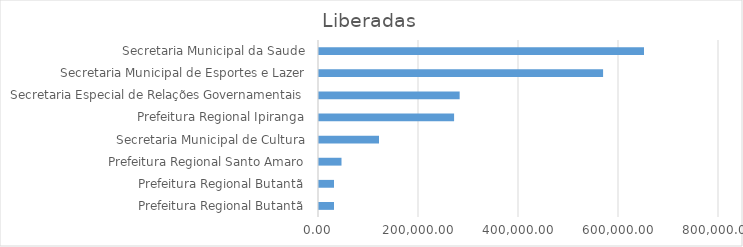
| Category | Series 0 |
|---|---|
| Prefeitura Regional Butantã | 30000 |
| Prefeitura Regional Butantã | 30000 |
| Prefeitura Regional Santo Amaro | 45000 |
| Secretaria Municipal de Cultura | 120000 |
| Prefeitura Regional Ipiranga | 270181 |
| Secretaria Especial de Relações Governamentais | 281318 |
| Secretaria Municipal de Esportes e Lazer | 568181 |
| Secretaria Municipal da Saude | 650000 |